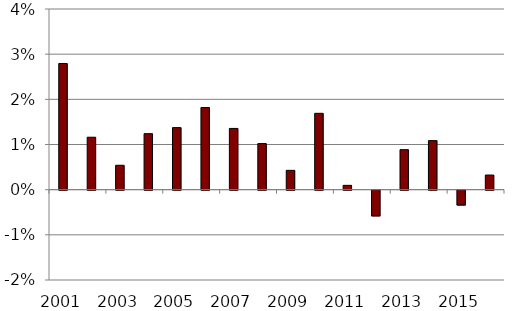
| Category | Series 0 |
|---|---|
| 2001.0 | 0.028 |
| 2002.0 | 0.012 |
| 2003.0 | 0.005 |
| 2004.0 | 0.012 |
| 2005.0 | 0.014 |
| 2006.0 | 0.018 |
| 2007.0 | 0.014 |
| 2008.0 | 0.01 |
| 2009.0 | 0.004 |
| 2010.0 | 0.017 |
| 2011.0 | 0.001 |
| 2012.0 | -0.006 |
| 2013.0 | 0.009 |
| 2014.0 | 0.011 |
| 2015.0 | -0.003 |
| 2016.0 | 0.003 |